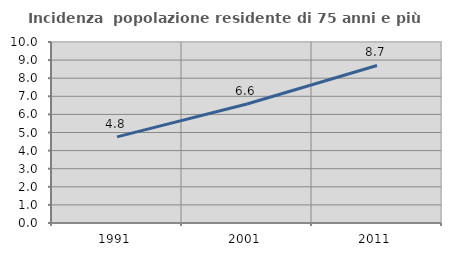
| Category | Incidenza  popolazione residente di 75 anni e più |
|---|---|
| 1991.0 | 4.758 |
| 2001.0 | 6.575 |
| 2011.0 | 8.704 |